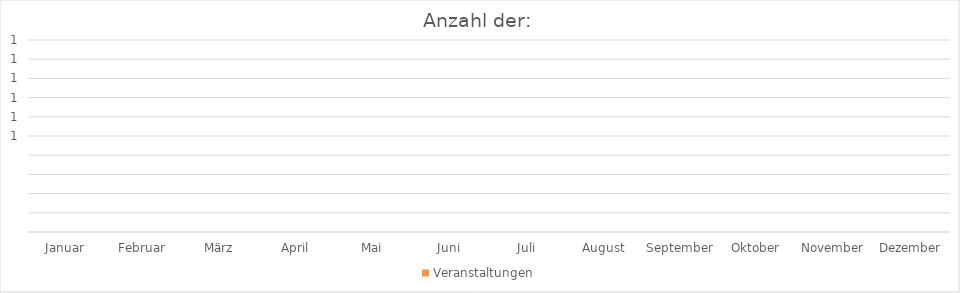
| Category | Veranstaltungen |
|---|---|
| Januar | 0 |
| Februar | 0 |
| März | 0 |
| April | 0 |
| Mai | 0 |
| Juni | 0 |
| Juli | 0 |
| August | 0 |
| September | 0 |
| Oktober | 0 |
| November | 0 |
| Dezember | 0 |